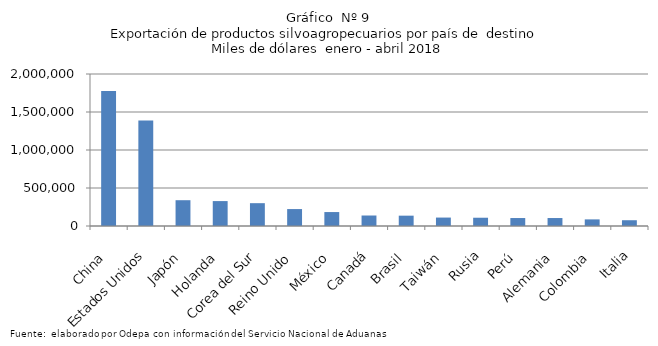
| Category | Series 0 |
|---|---|
| China | 1776948.901 |
| Estados Unidos | 1388059.216 |
| Japón | 339416.146 |
| Holanda | 327854.413 |
| Corea del Sur | 300343.819 |
| Reino Unido | 222839.794 |
| México | 183518.232 |
| Canadá | 138065.329 |
| Brasil | 136016.432 |
| Taiwán | 110966.711 |
| Rusia | 108790.337 |
| Perú | 104818.417 |
| Alemania | 104812.602 |
| Colombia | 87028.648 |
| Italia | 75961.098 |